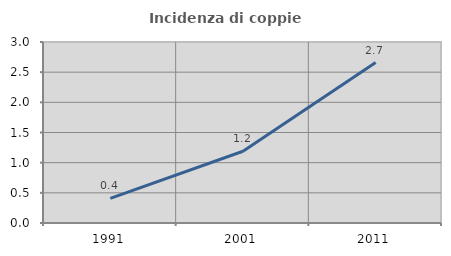
| Category | Incidenza di coppie miste |
|---|---|
| 1991.0 | 0.409 |
| 2001.0 | 1.189 |
| 2011.0 | 2.659 |